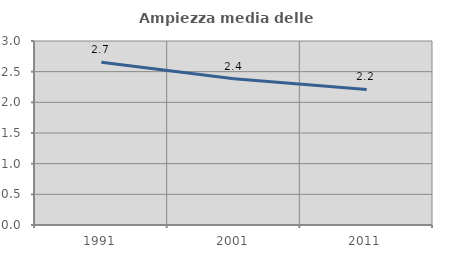
| Category | Ampiezza media delle famiglie |
|---|---|
| 1991.0 | 2.654 |
| 2001.0 | 2.386 |
| 2011.0 | 2.211 |